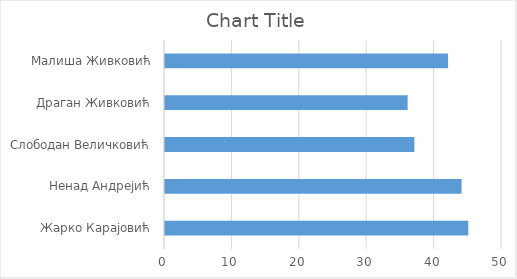
| Category | Series 0 |
|---|---|
| Жарко Карајовић | 45 |
| Ненад Андрејић | 44 |
| Слободан Величковић | 37 |
| Драган Живковић | 36 |
| Малиша Живковић | 42 |